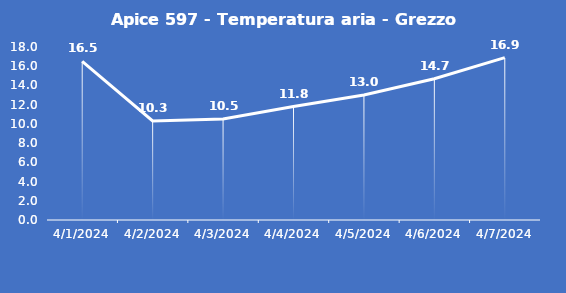
| Category | Apice 597 - Temperatura aria - Grezzo (°C) |
|---|---|
| 4/1/24 | 16.5 |
| 4/2/24 | 10.3 |
| 4/3/24 | 10.5 |
| 4/4/24 | 11.8 |
| 4/5/24 | 13 |
| 4/6/24 | 14.7 |
| 4/7/24 | 16.9 |